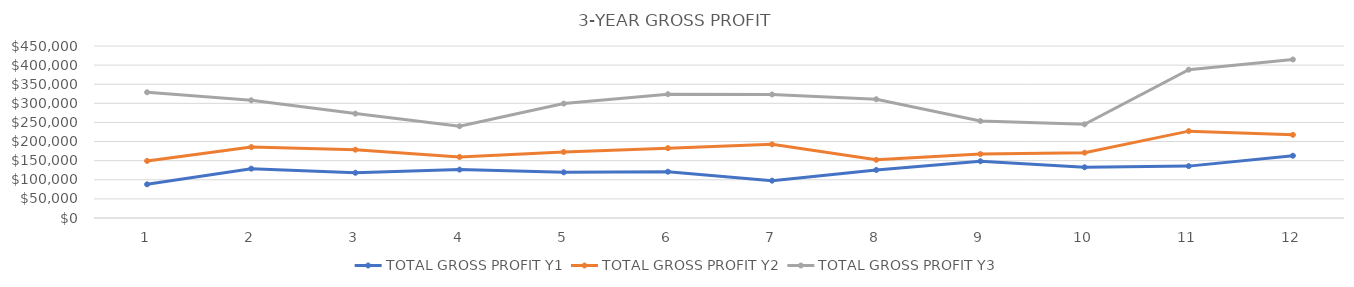
| Category | TOTAL GROSS PROFIT Y1 | TOTAL GROSS PROFIT Y2 | TOTAL GROSS PROFIT Y3 |
|---|---|---|---|
| 0 | 88114 | 149299.8 | 328920.1 |
| 1 | 129087 | 185572.05 | 307938.2 |
| 2 | 118320 | 178734.75 | 273173.6 |
| 3 | 126600 | 159643.5 | 240058.1 |
| 4 | 119528 | 172671.8 | 299376.2 |
| 5 | 121091.5 | 182784.4 | 323907 |
| 6 | 97705.5 | 192648.75 | 323256.1 |
| 7 | 125637 | 152163.2 | 310748.5 |
| 8 | 148434 | 167284.6 | 253671.3 |
| 9 | 132710 | 170910.05 | 245075.1 |
| 10 | 135723 | 227271.75 | 388017.1 |
| 11 | 162928 | 217656 | 414703.8 |